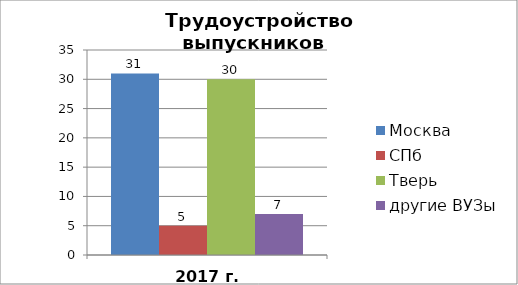
| Category | Москва | СПб | Тверь | другие ВУЗы |
|---|---|---|---|---|
| 2017 г. | 31 | 5 | 30 | 7 |